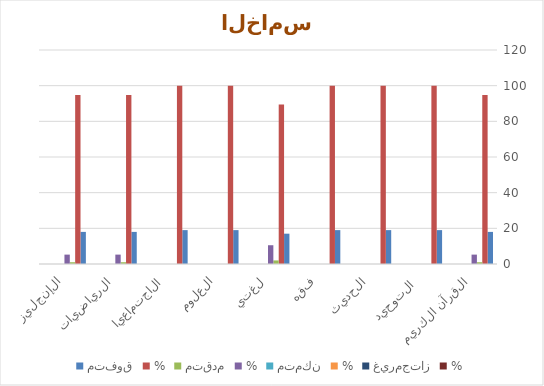
| Category | متفوق | % | متقدم | متمكن | غيرمجتاز |
|---|---|---|---|---|---|
| القرآن الكريم | 18 | 0 | 1 | 0 | 0 |
| التوحيد  | 19 | 0 | 0 | 0 | 0 |
| الحديث | 19 | 0 | 0 | 0 | 0 |
| فقه | 19 | 0 | 0 | 0 | 0 |
| لغتي | 17 | 0 | 2 | 0 | 0 |
| العلوم | 19 | 0 | 0 | 0 | 0 |
| الاجتماعيات | 19 | 0 | 0 | 0 | 0 |
| الرياضيات | 18 | 0 | 1 | 0 | 0 |
| الإنجليزي | 18 | 0 | 1 | 0 | 0 |